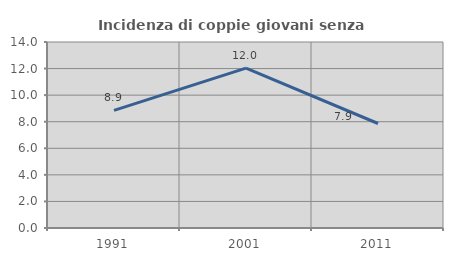
| Category | Incidenza di coppie giovani senza figli |
|---|---|
| 1991.0 | 8.855 |
| 2001.0 | 12.038 |
| 2011.0 | 7.865 |